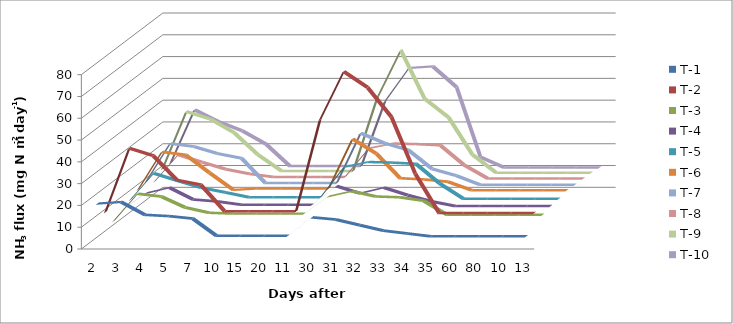
| Category | T-1 | T-2  | T-3 | T-4 | T-5  | T-6 | T-7 | T-8 | T-9  | T-10  |
|---|---|---|---|---|---|---|---|---|---|---|
| 2.0 | 18.9 | 12.09 | 5.18 | 7.45 | 9.09 | 11.09 | 12.09 | 9.09 | 12.09 | 12.09 |
| 3.0 | 19.625 | 41.48 | 17.77 | 15.125 | 21.48 | 28.48 | 29.48 | 21.48 | 38.48 | 36.48 |
| 4.0 | 13.733 | 38.08 | 16.48 | 17.733 | 18.08 | 27.08 | 28.08 | 18.08 | 35.08 | 31.08 |
| 5.0 | 13.15 | 26.85 | 11.48 | 12.275 | 14.85 | 18.85 | 24.85 | 14.85 | 28.85 | 26.85 |
| 7.0 | 12.03 | 24.72 | 9.03 | 11.4 | 12.72 | 11.02 | 22.72 | 12.72 | 18.72 | 20.72 |
| 10.0 | 4.133 | 12.573 | 8.625 | 9.899 | 10.465 | 11.646 | 11.334 | 11.289 | 11.159 | 10.647 |
| 15.0 | 4.133 | 12.573 | 8.625 | 9.899 | 10.465 | 11.646 | 11.334 | 11.289 | 11.159 | 10.647 |
| 20.0 | 4.133 | 12.573 | 8.625 | 9.899 | 10.465 | 11.646 | 11.334 | 11.289 | 11.159 | 10.647 |
| 11.0 | 4.133 | 12.573 | 8.625 | 9.899 | 10.465 | 11.646 | 11.334 | 11.289 | 11.159 | 10.647 |
| 30.0 | 12.6 | 54.44 | 16.48 | 18.45 | 24.44 | 34.44 | 34.25 | 24.44 | 44.44 | 40.44 |
| 31.0 | 11.6 | 76.66 | 18.92 | 15.125 | 26.66 | 27.66 | 29.66 | 26.66 | 66.66 | 55.66 |
| 32.0 | 9.033 | 69.38 | 16.5 | 17.733 | 26.38 | 16.38 | 26.48 | 26.38 | 44.38 | 56.38 |
| 33.0 | 6.488 | 55.83 | 16.138 | 14.275 | 25.83 | 15.83 | 17.83 | 25.83 | 35.83 | 46.83 |
| 34.0 | 5.176 | 29.77 | 14.56 | 11.4 | 16.77 | 14.77 | 14.77 | 16.77 | 18.77 | 14.77 |
| 35.0 | 3.863 | 11.75 | 8.06 | 9.252 | 9.781 | 10.884 | 10.592 | 10.551 | 10.429 | 9.951 |
| 60.0 | 3.863 | 11.75 | 8.06 | 9.252 | 9.781 | 10.884 | 10.592 | 10.551 | 10.429 | 9.951 |
| 80.0 | 3.863 | 11.75 | 8.06 | 9.252 | 9.781 | 10.884 | 10.592 | 10.551 | 10.429 | 9.951 |
| 100.0 | 3.863 | 11.75 | 8.06 | 9.252 | 9.781 | 10.884 | 10.592 | 10.551 | 10.429 | 9.951 |
| 135.0 | 3.863 | 11.75 | 8.06 | 9.252 | 9.781 | 10.884 | 10.592 | 10.551 | 10.429 | 9.951 |